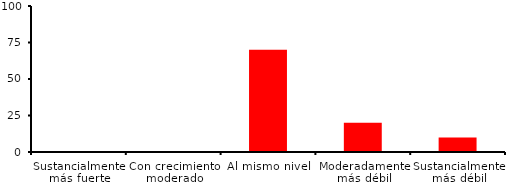
| Category | Series 0 |
|---|---|
| Sustancialmente más fuerte | 0 |
| Con crecimiento moderado | 0 |
| Al mismo nivel | 70 |
| Moderadamente más débil | 20 |
| Sustancialmente más débil | 10 |